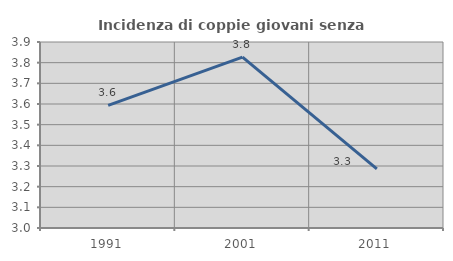
| Category | Incidenza di coppie giovani senza figli |
|---|---|
| 1991.0 | 3.593 |
| 2001.0 | 3.827 |
| 2011.0 | 3.286 |